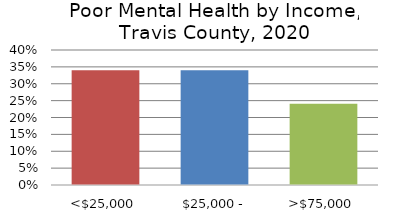
| Category | Series 0 |
|---|---|
| <$25,000 | 0.34 |
| $25,000 - $75,000 | 0.34 |
| >$75,000 | 0.241 |